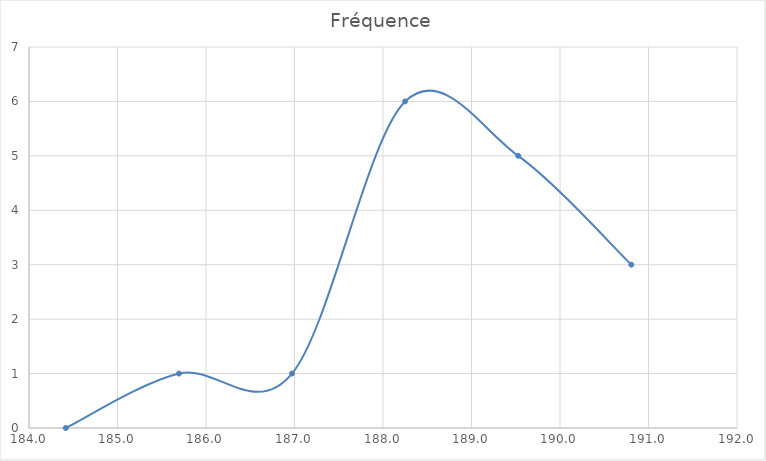
| Category | Fréquence |
|---|---|
| 184.41594209746384 | 0 |
| 185.69396139830923 | 1 |
| 186.9719806991546 | 1 |
| 188.25 | 6 |
| 189.5280193008454 | 5 |
| 190.80603860169077 | 3 |